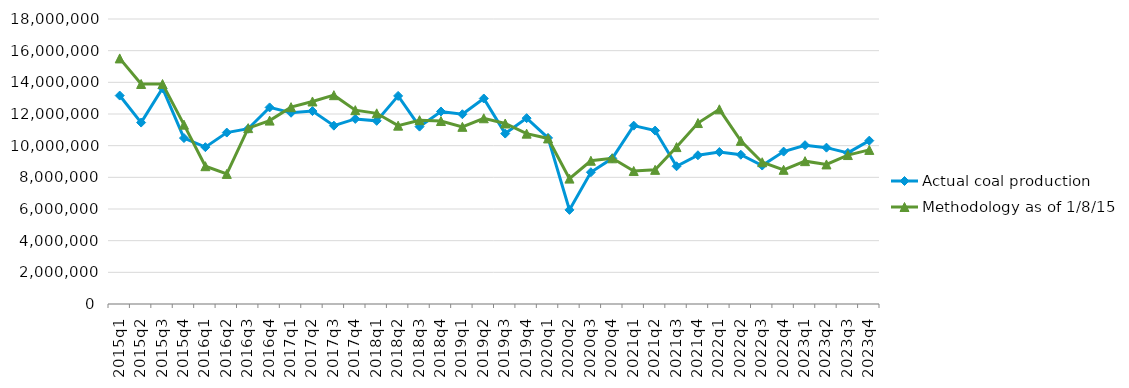
| Category | Actual coal production | Methodology as of 1/8/15 |
|---|---|---|
| 2015q1 | 13165176 | 15510949 |
| 2015q2 | 11458694 | 13896090 |
| 2015q3 | 13625272 | 13892074 |
| 2015q4 | 10480814 | 11326934 |
| 2016q1 | 9905722 | 8703249 |
| 2016q2 | 10827823 | 8217339 |
| 2016q3 | 11070998 | 11108858 |
| 2016q4 | 12416013 | 11583325 |
| 2017q1 | 12079835 | 12431544 |
| 2017q2 | 12185228 | 12790712 |
| 2017q3 | 11264112 | 13188665 |
| 2017q4 | 11689653 | 12241878 |
| 2018q1 | 11566892 | 12042731 |
| 2018q2 | 13143693 | 11263256 |
| 2018q3 | 11202055 | 11608755 |
| 2018q4 | 12159377 | 11556093 |
| 2019q1 | 11985062 | 11189487 |
| 2019q2 | 12978954 | 11731052 |
| 2019q3 | 10763999 | 11400288 |
| 2019q4 | 11739180 | 10759265 |
| 2020q1 | 10489253 | 10456576 |
| 2020q2 | 5943010 | 7918469 |
| 2020q3 | 8321256 | 9047883 |
| 2020q4 | 9199981 | 9201699 |
| 2021q1 | 11264364 | 8402637 |
| 2021q2 | 10952865 | 8472208 |
| 2021q3 | 8699331 | 9909831 |
| 2021q4 | 9394271 | 11428807 |
| 2022q1 | 9597056 | 12295883 |
| 2022q2 | 9428602 | 10304493 |
| 2022q3 | 8745173 | 8953890 |
| 2022q4 | 9625514 | 8475268 |
| 2023q1 | 10029359 | 9022549 |
| 2023q2 | 9874725 | 8814603 |
| 2023q3 | 9542679 | 9406902 |
| 2023q4 | 10316911 | 9731931 |